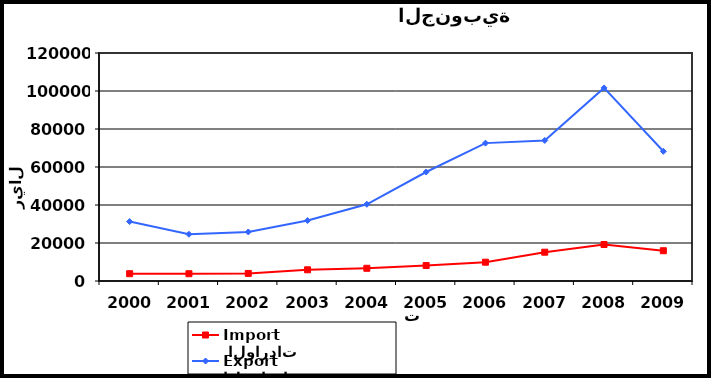
| Category |  الواردات           Import | الصادرات          Export |
|---|---|---|
| 2000.0 | 3846 | 31273 |
| 2001.0 | 3831 | 24621 |
| 2002.0 | 3989 | 25813 |
| 2003.0 | 5897 | 31816 |
| 2004.0 | 6688 | 40382 |
| 2005.0 | 8138 | 57368 |
| 2006.0 | 9900 | 72570 |
| 2007.0 | 15162 | 73972 |
| 2008.0 | 19218 | 101621 |
| 2009.0 | 15931 | 68263 |